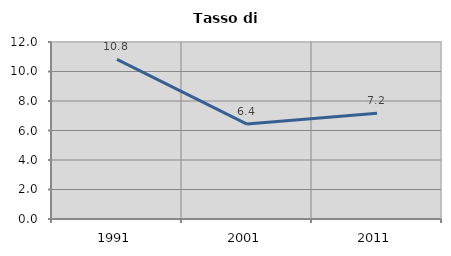
| Category | Tasso di disoccupazione   |
|---|---|
| 1991.0 | 10.822 |
| 2001.0 | 6.437 |
| 2011.0 | 7.176 |